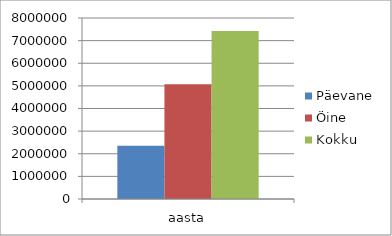
| Category | Päevane | Öine | Kokku |
|---|---|---|---|
| aasta | 2352068.498 | 5074849.745 | 7426918.243 |